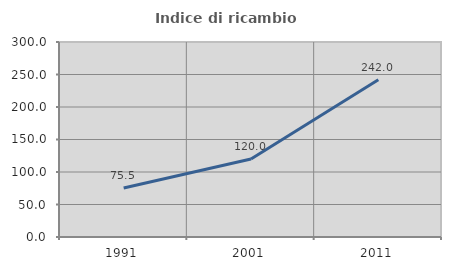
| Category | Indice di ricambio occupazionale  |
|---|---|
| 1991.0 | 75.495 |
| 2001.0 | 120.028 |
| 2011.0 | 242.029 |